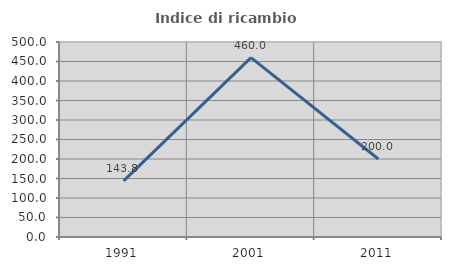
| Category | Indice di ricambio occupazionale  |
|---|---|
| 1991.0 | 143.75 |
| 2001.0 | 460 |
| 2011.0 | 200 |